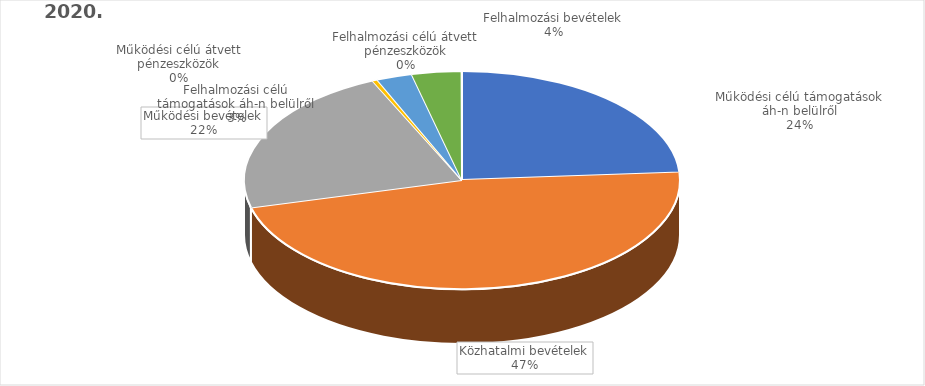
| Category | 2020. év |
|---|---|
| Működési célú támogatások áh-n belülről | 7384765000 |
| Közhatalmi bevételek | 14559920000 |
| Működési bevételek | 6892862000 |
| Működési célú átvett pénzeszközök | 117000000 |
| Felhalmozási célú támogatások áh-n belülről | 819994000 |
| Felhalmozási bevételek | 1138796000 |
| Felhalmozási célú átvett pénzeszközök | 9000000 |